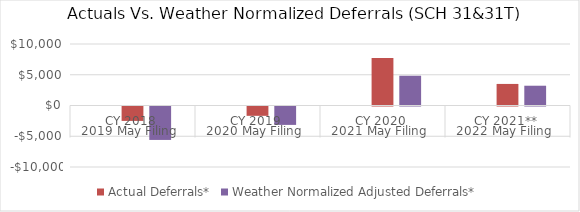
| Category | Residential: SCH 23&53 | Actual Deferrals* | Weather Normalized Adjusted Deferrals* |
|---|---|---|---|
| 0 |  | -2343.13 | -5436.332 |
| 1 |  | -1517.327 | -2992.141 |
| 2 |  | 7705.545 | 4838.457 |
| 3 |  | 3507.004 | 3215.554 |